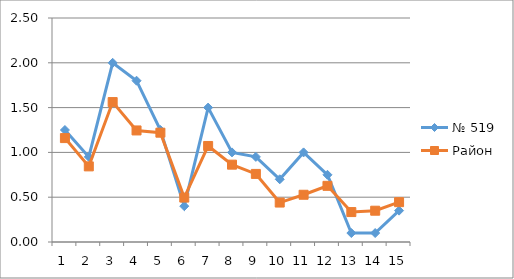
| Category | № 519 | Район |
|---|---|---|
| 0 | 1.25 | 1.16 |
| 1 | 0.95 | 0.844 |
| 2 | 2 | 1.562 |
| 3 | 1.8 | 1.245 |
| 4 | 1.25 | 1.22 |
| 5 | 0.4 | 0.496 |
| 6 | 1.5 | 1.072 |
| 7 | 1 | 0.863 |
| 8 | 0.95 | 0.76 |
| 9 | 0.7 | 0.44 |
| 10 | 1 | 0.527 |
| 11 | 0.75 | 0.627 |
| 12 | 0.1 | 0.334 |
| 13 | 0.1 | 0.349 |
| 14 | 0.35 | 0.445 |